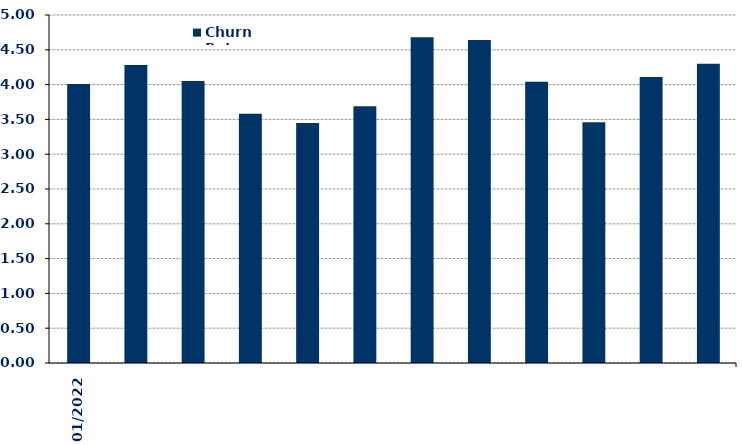
| Category | Churn Rate |
|---|---|
| 2022-01-01 | 4.01 |
| 2022-02-01 | 4.28 |
| 2022-03-01 | 4.05 |
| 2022-04-01 | 3.58 |
| 2022-05-01 | 3.45 |
| 2022-06-01 | 3.69 |
| 2022-07-01 | 4.68 |
| 2022-08-01 | 4.64 |
| 2022-09-01 | 4.04 |
| 2022-10-01 | 3.46 |
| 2022-11-01 | 4.11 |
| 2022-12-01 | 4.3 |